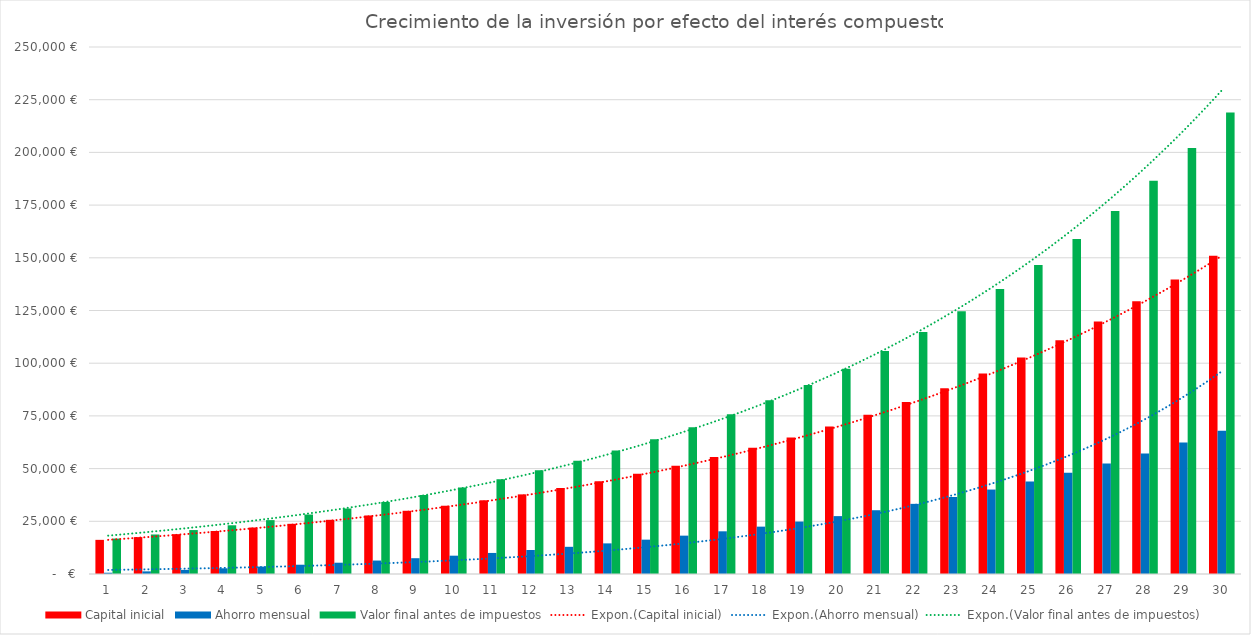
| Category | Capital inicial | Ahorro mensual | Valor final antes de impuestos |
|---|---|---|---|
| 0 | 16200 | 600 | 16800 |
| 1 | 17496 | 1248 | 18744 |
| 2 | 18895.68 | 1947.84 | 20843.52 |
| 3 | 20407.334 | 2703.667 | 23111.002 |
| 4 | 22039.921 | 3519.961 | 25559.882 |
| 5 | 23803.115 | 4401.557 | 28204.672 |
| 6 | 25707.364 | 5353.682 | 31061.046 |
| 7 | 27763.953 | 6381.977 | 34145.93 |
| 8 | 29985.069 | 7492.535 | 37477.604 |
| 9 | 32383.875 | 8691.937 | 41075.812 |
| 10 | 34974.585 | 9987.292 | 44961.877 |
| 11 | 37772.552 | 11386.276 | 49158.828 |
| 12 | 40794.356 | 12897.178 | 53691.534 |
| 13 | 44057.904 | 14528.952 | 58586.857 |
| 14 | 47582.537 | 16291.268 | 63873.805 |
| 15 | 51389.14 | 18194.57 | 69583.709 |
| 16 | 55500.271 | 20250.135 | 75750.406 |
| 17 | 59940.292 | 22470.146 | 82410.439 |
| 18 | 64735.516 | 24867.758 | 89603.274 |
| 19 | 69914.357 | 27457.179 | 97371.536 |
| 20 | 75507.506 | 30253.753 | 105761.259 |
| 21 | 81548.106 | 33274.053 | 114822.159 |
| 22 | 88071.955 | 36535.977 | 124607.932 |
| 23 | 95117.711 | 40058.856 | 135176.567 |
| 24 | 102727.128 | 43863.564 | 146590.692 |
| 25 | 110945.298 | 47972.649 | 158917.947 |
| 26 | 119820.922 | 52410.461 | 172231.383 |
| 27 | 129406.596 | 57203.298 | 186609.894 |
| 28 | 139759.123 | 62379.562 | 202138.685 |
| 29 | 150939.853 | 67969.927 | 218909.78 |